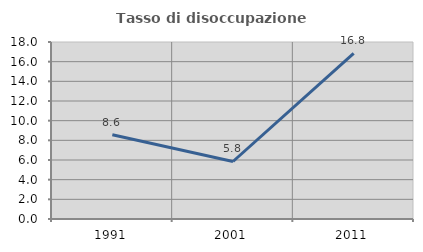
| Category | Tasso di disoccupazione giovanile  |
|---|---|
| 1991.0 | 8.571 |
| 2001.0 | 5.848 |
| 2011.0 | 16.845 |